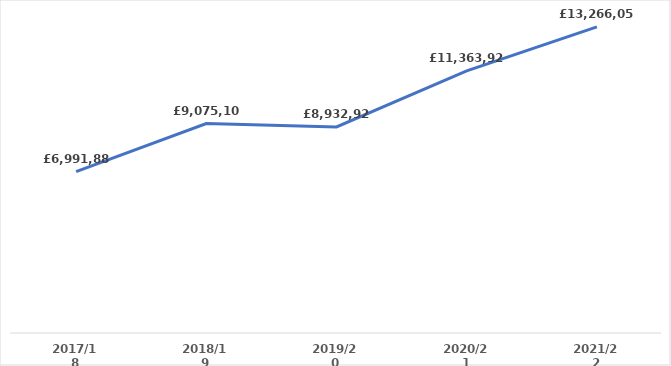
| Category | Series 0 |
|---|---|
| 2017/18 | 6991883.7 |
| 2018/19 | 9075105.78 |
| 2019/20 | 8932928.39 |
| 2020/21 | 11363927.05 |
| 2021/22 | 13266052.414 |